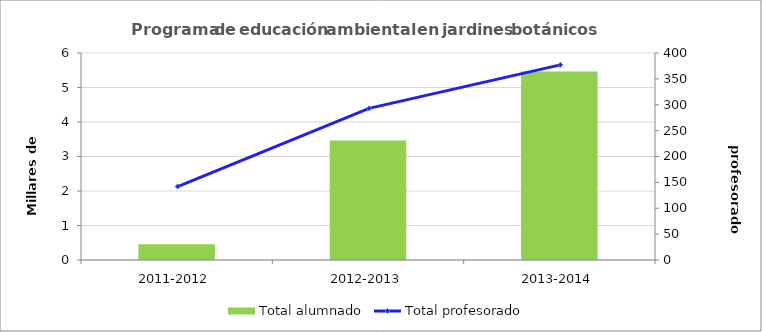
| Category | Total alumnado |
|---|---|
| 2011-2012 | 457 |
| 2012-2013 | 3467 |
| 2013-2014 | 5461 |